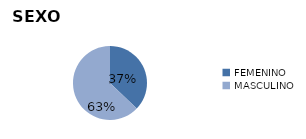
| Category | Series 0 |
|---|---|
| FEMENINO | 1036 |
| MASCULINO | 1755 |